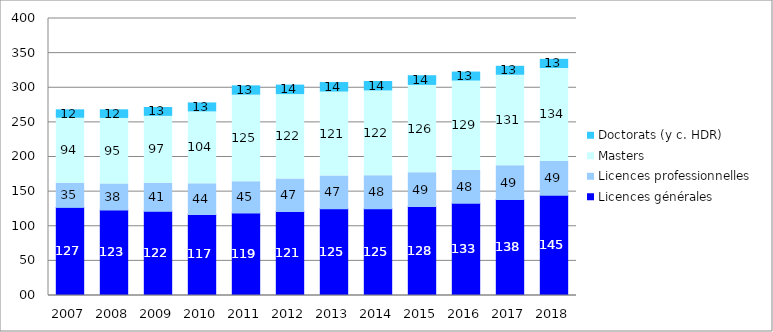
| Category | Licences générales | Licences professionnelles | Masters | Doctorats (y c. HDR) |
|---|---|---|---|---|
| 2007.0 | 127232 | 34915 | 93830 | 12129 |
| 2008.0 | 123465 | 37665 | 94546 | 12476 |
| 2009.0 | 121592 | 40520 | 96566 | 12824 |
| 2010.0 | 116996 | 44235 | 103861 | 12988 |
| 2011.0 | 118959 | 45378 | 124903 | 13489 |
| 2012.0 | 121326 | 46760 | 122044 | 13686 |
| 2013.0 | 125163 | 47304 | 121298 | 13748 |
| 2014.0 | 125190 | 47749 | 122426 | 13675 |
| 2015.0 | 128396 | 48744 | 126262 | 13957 |
| 2016.0 | 133053 | 47777 | 128815 | 13008 |
| 2017.0 | 138499 | 48823 | 130716 | 12939 |
| 2018.0 | 144838 | 48753 | 134173 | 13314 |